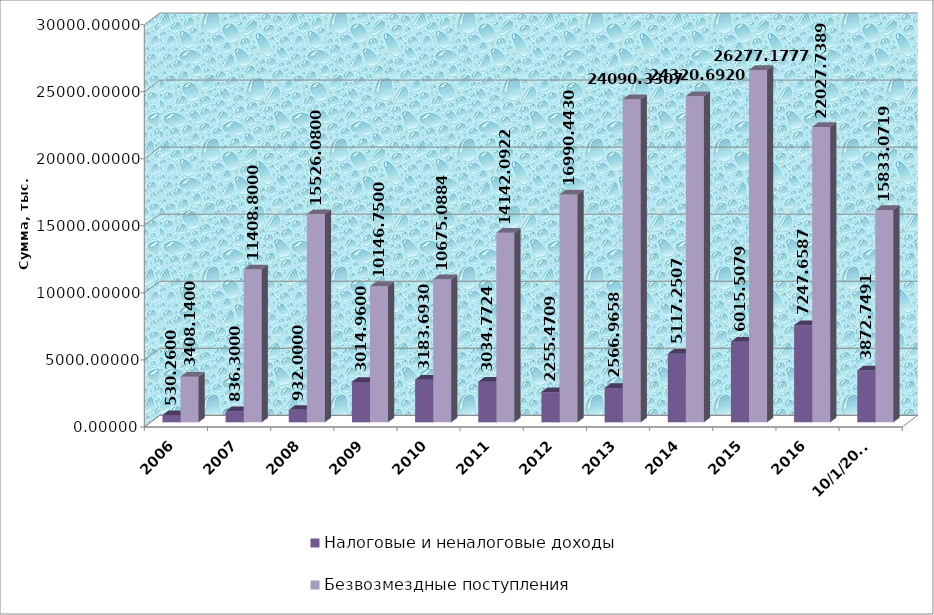
| Category | Налоговые и неналоговые доходы | Безвозмездные поступления |
|---|---|---|
| 2006.0 | 530.26 | 3408.14 |
| 2007.0 | 836.3 | 11408.8 |
| 2008.0 | 932 | 15526.08 |
| 2009.0 | 3014.96 | 10146.75 |
| 2010.0 | 3183.693 | 10675.088 |
| 2011.0 | 3034.772 | 14142.092 |
| 2012.0 | 2255.471 | 16990.443 |
| 2013.0 | 2566.966 | 24090.331 |
| 2014.0 | 5117.251 | 24320.692 |
| 2015.0 | 6015.508 | 26277.178 |
| 2016.0 | 7247.659 | 22027.739 |
| 43009.0 | 3872.749 | 15833.072 |